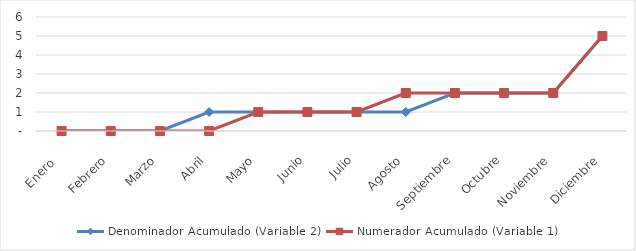
| Category | Denominador Acumulado (Variable 2) | Numerador Acumulado (Variable 1) |
|---|---|---|
| Enero  | 0 | 0 |
| Febrero | 0 | 0 |
| Marzo | 0 | 0 |
| Abril | 1 | 0 |
| Mayo | 1 | 1 |
| Junio | 1 | 1 |
| Julio | 1 | 1 |
| Agosto | 1 | 2 |
| Septiembre | 2 | 2 |
| Octubre | 2 | 2 |
| Noviembre | 2 | 2 |
| Diciembre | 5 | 5 |